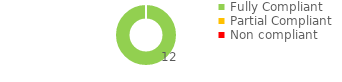
| Category | Series 0 |
|---|---|
| Fully Compliant | 12 |
| Partial Compliant | 0 |
| Non compliant | 0 |